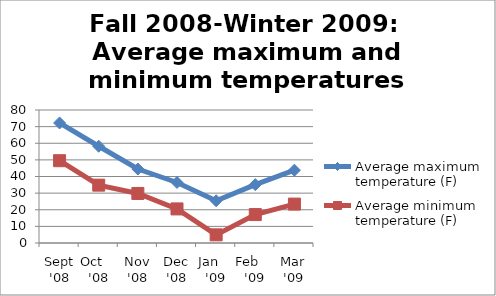
| Category | Average maximum temperature (F) | Average minimum temperature (F) |
|---|---|---|
| Sept '08 | 72.2 | 49.5 |
| Oct    '08 | 58.2 | 34.8 |
| Nov '08 | 44.5 | 29.8 |
| Dec '08 | 36.4 | 20.5 |
| Jan    '09 | 25.4 | 4.9 |
| Feb    '09 | 35.1 | 17.1 |
| Mar '09 | 43.8 | 23.4 |